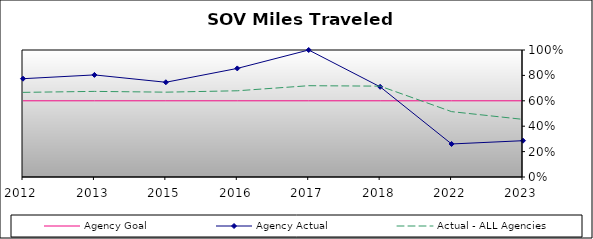
| Category | Agency Goal | Agency Actual | Actual - ALL Agencies |
|---|---|---|---|
| 2012.0 | 0.6 | 0.774 | 0.666 |
| 2013.0 | 0.6 | 0.804 | 0.674 |
| 2015.0 | 0.6 | 0.746 | 0.668 |
| 2016.0 | 0.6 | 0.855 | 0.679 |
| 2017.0 | 0.6 | 1 | 0.719 |
| 2018.0 | 0.6 | 0.71 | 0.715 |
| 2022.0 | 0.6 | 0.26 | 0.515 |
| 2023.0 | 0.6 | 0.286 | 0.454 |